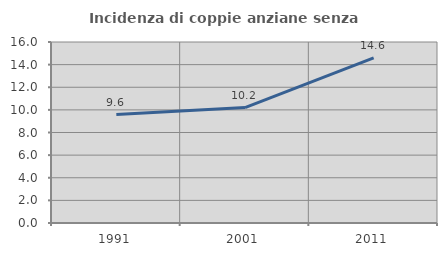
| Category | Incidenza di coppie anziane senza figli  |
|---|---|
| 1991.0 | 9.581 |
| 2001.0 | 10.204 |
| 2011.0 | 14.592 |